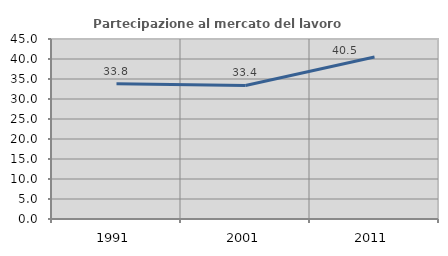
| Category | Partecipazione al mercato del lavoro  femminile |
|---|---|
| 1991.0 | 33.793 |
| 2001.0 | 33.391 |
| 2011.0 | 40.496 |